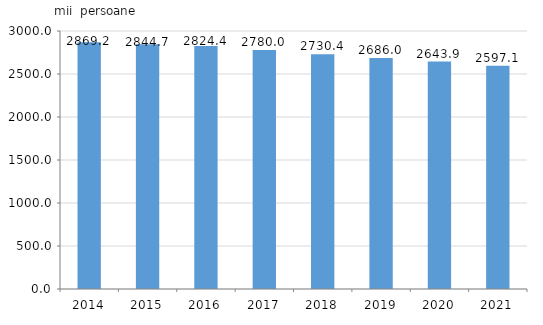
| Category | Populația la începutul anului,
1 ianuarie  |
|---|---|
| 2014.0 | 2869.226 |
| 2015.0 | 2844.673 |
| 2016.0 | 2824.387 |
| 2017.0 | 2779.952 |
| 2018.0 | 2730.364 |
| 2019.0 | 2686 |
| 2020.0 | 2643.9 |
| 2021.0 | 2597.107 |